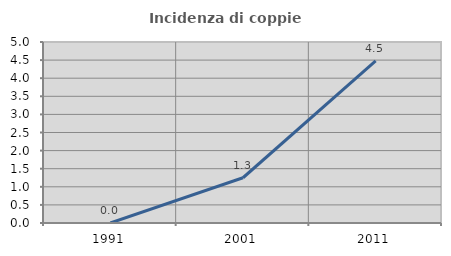
| Category | Incidenza di coppie miste |
|---|---|
| 1991.0 | 0 |
| 2001.0 | 1.25 |
| 2011.0 | 4.478 |